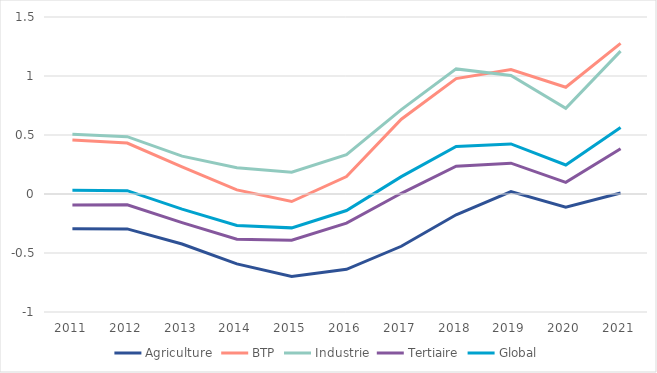
| Category | Agriculture | BTP | Industrie | Tertiaire | Global |
|---|---|---|---|---|---|
| 2011.0 | -0.295 | 0.458 | 0.507 | -0.093 | 0.032 |
| 2012.0 | -0.296 | 0.432 | 0.486 | -0.092 | 0.028 |
| 2013.0 | -0.424 | 0.23 | 0.321 | -0.243 | -0.128 |
| 2014.0 | -0.592 | 0.035 | 0.222 | -0.383 | -0.266 |
| 2015.0 | -0.699 | -0.064 | 0.185 | -0.391 | -0.287 |
| 2016.0 | -0.638 | 0.148 | 0.334 | -0.247 | -0.14 |
| 2017.0 | -0.443 | 0.634 | 0.715 | 0.006 | 0.147 |
| 2018.0 | -0.176 | 0.978 | 1.06 | 0.235 | 0.403 |
| 2019.0 | 0.02 | 1.054 | 1.005 | 0.261 | 0.424 |
| 2020.0 | -0.111 | 0.905 | 0.726 | 0.099 | 0.246 |
| 2021.0 | 0.009 | 1.277 | 1.211 | 0.384 | 0.564 |